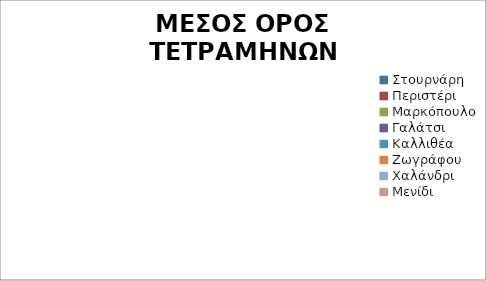
| Category | ΜΕΣΟΣ ΟΡΟΣ ΤΕΤΡΑΜΗΝΩΝ ΚΑΤΑΣΤΗΜΑΤΟΣ |
|---|---|
| Στουρνάρη | 0 |
| Περιστέρι | 0 |
| Μαρκόπουλο | 0 |
| Γαλάτσι | 0 |
| Καλλιθέα | 0 |
| Ζωγράφου | 0 |
| Χαλάνδρι | 0 |
| Μενίδι | 0 |